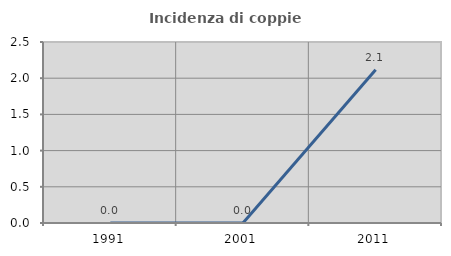
| Category | Incidenza di coppie miste |
|---|---|
| 1991.0 | 0 |
| 2001.0 | 0 |
| 2011.0 | 2.116 |